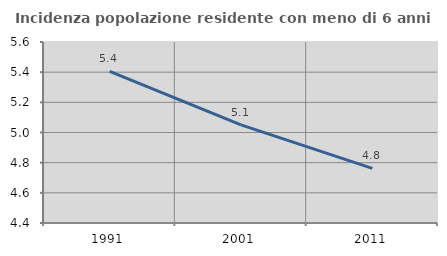
| Category | Incidenza popolazione residente con meno di 6 anni |
|---|---|
| 1991.0 | 5.405 |
| 2001.0 | 5.051 |
| 2011.0 | 4.762 |